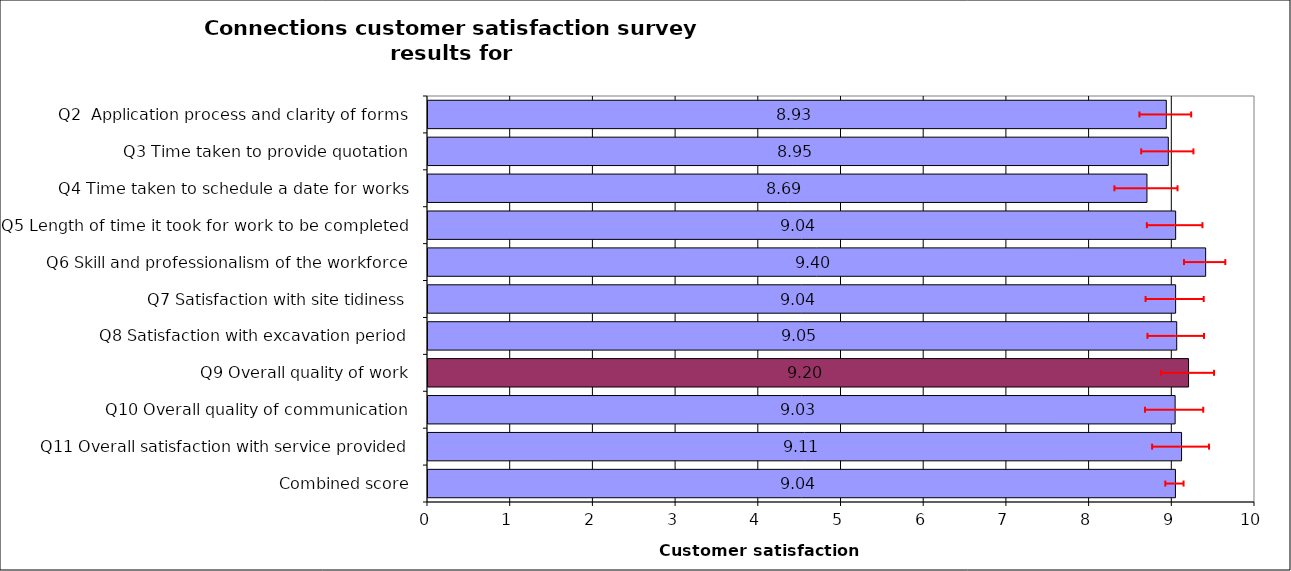
| Category | Series 0 |
|---|---|
| Q2  Application process and clarity of forms | 8.927 |
| Q3 Time taken to provide quotation | 8.952 |
| Q4 Time taken to schedule a date for works | 8.694 |
| Q5 Length of time it took for work to be completed | 9.041 |
| Q6 Skill and professionalism of the workforce | 9.403 |
| Q7 Satisfaction with site tidiness | 9.04 |
| Q8 Satisfaction with excavation period | 9.054 |
| Q9 Overall quality of work | 9.197 |
| Q10 Overall quality of communication | 9.034 |
| Q11 Overall satisfaction with service provided | 9.112 |
| Combined score | 9.038 |